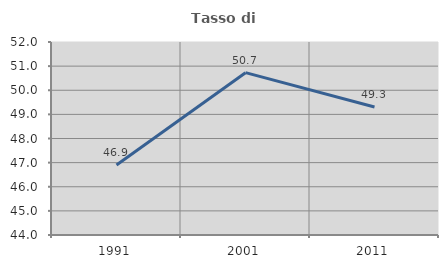
| Category | Tasso di occupazione   |
|---|---|
| 1991.0 | 46.905 |
| 2001.0 | 50.729 |
| 2011.0 | 49.305 |